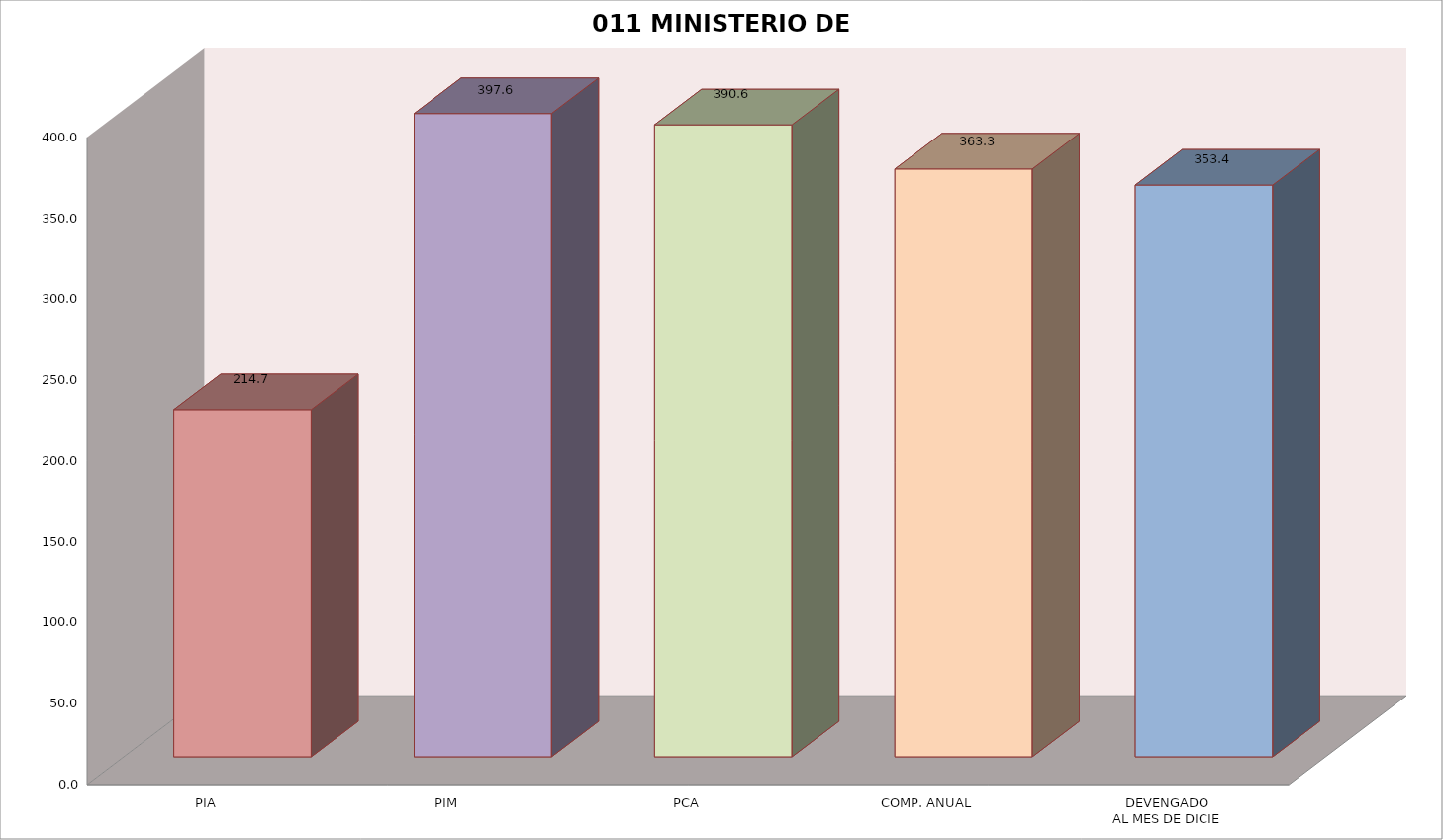
| Category | 011 MINISTERIO DE SALUD |
|---|---|
| PIA | 214.675 |
| PIM | 397.585 |
| PCA | 390.598 |
| COMP. ANUAL | 363.277 |
| DEVENGADO
AL MES DE DICIE | 353.351 |